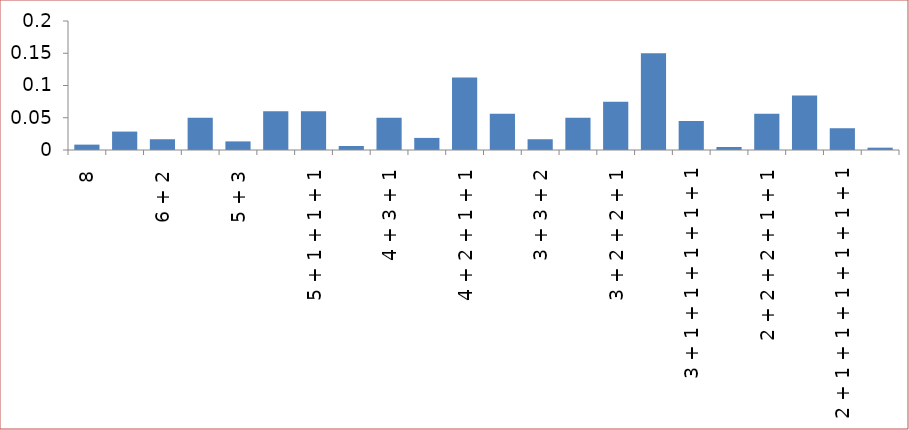
| Category | Series 0 |
|---|---|
| 8 | 0.008 |
| 7 + 1 | 0.029 |
| 6 + 2 | 0.017 |
| 6 + 1 + 1 | 0.05 |
| 5 + 3 | 0.013 |
| 5 + 2 + 1 | 0.06 |
| 5 + 1 + 1 + 1 | 0.06 |
| 4 + 4 | 0.006 |
| 4 + 3 + 1 | 0.05 |
| 4 + 2 + 2 | 0.019 |
| 4 + 2 + 1 + 1 | 0.112 |
| 4 + 1 + 1 + 1 + 1 | 0.056 |
| 3 + 3 + 2 | 0.017 |
| 3 + 3 + 1 + 1 | 0.05 |
| 3 + 2 + 2 + 1 | 0.075 |
| 3 + 2 + 1 + 1 + 1 | 0.15 |
| 3 + 1 + 1 + 1 + 1 + 1 | 0.045 |
| 2 + 2 + 2 + 2 | 0.005 |
| 2 + 2 + 2 + 1 + 1 | 0.056 |
| 2 + 2 + 1 + 1 + 1 + 1 | 0.084 |
| 2 + 1 + 1 + 1 + 1 + 1 + 1 | 0.034 |
| 1 + 1 + 1 + 1 + 1 + 1 + 1 + 1 | 0.004 |